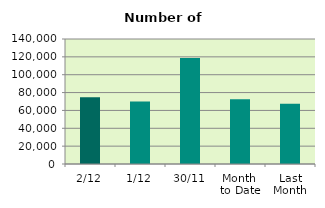
| Category | Series 0 |
|---|---|
| 2/12 | 74744 |
| 1/12 | 70098 |
| 30/11 | 118652 |
| Month 
to Date | 72421 |
| Last
Month | 67470.455 |